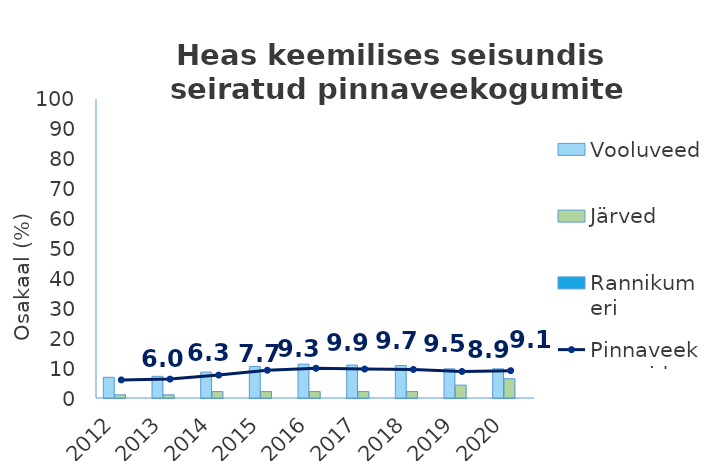
| Category | Vooluveed | Järved | Rannikumeri |
|---|---|---|---|
| 2012.0 | 6.929 | 1.075 | 0 |
| 2013.0 | 7.244 | 1.075 | 0 |
| 2014.0 | 8.661 | 2.151 | 0 |
| 2015.0 | 10.551 | 2.151 | 0 |
| 2016.0 | 11.339 | 2.151 | 0 |
| 2017.0 | 11.024 | 2.151 | 0 |
| 2018.0 | 10.866 | 2.151 | 0 |
| 2019.0 | 9.764 | 4.301 | 0 |
| 2020.0 | 9.764 | 6.452 | 0 |